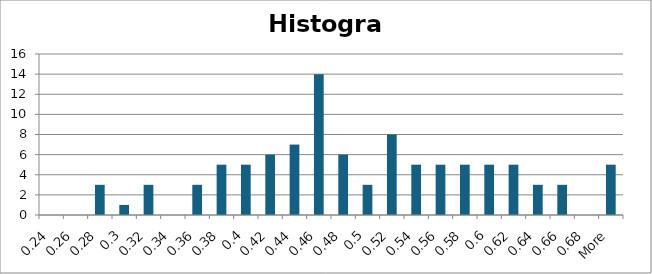
| Category | Frequency |
|---|---|
| 0.24 | 0 |
| 0.26 | 0 |
| 0.28 | 3 |
| 0.3 | 1 |
| 0.32 | 3 |
| 0.34 | 0 |
| 0.36 | 3 |
| 0.38 | 5 |
| 0.4 | 5 |
| 0.42 | 6 |
| 0.44 | 7 |
| 0.46 | 14 |
| 0.48 | 6 |
| 0.5 | 3 |
| 0.52 | 8 |
| 0.54 | 5 |
| 0.56 | 5 |
| 0.58 | 5 |
| 0.6 | 5 |
| 0.62 | 5 |
| 0.64 | 3 |
| 0.66 | 3 |
| 0.68 | 0 |
| More | 5 |